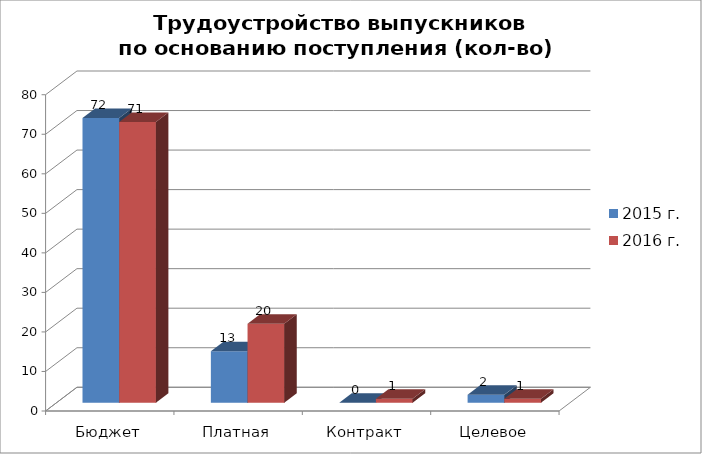
| Category | 2015 г. | 2016 г. |
|---|---|---|
| Бюджет | 72 | 71 |
| Платная | 13 | 20 |
| Контракт | 0 | 1 |
| Целевое | 2 | 1 |